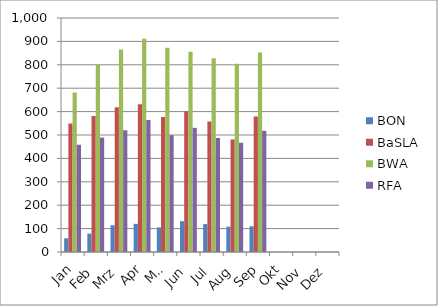
| Category | BON | BaSLA | BWA | RFA |
|---|---|---|---|---|
| Jan | 58.682 | 549.318 | 681.864 | 458.182 |
| Feb | 78.65 | 581.35 | 799.4 | 488.95 |
| Mrz | 114 | 618.55 | 865.05 | 520.15 |
| Apr | 120.286 | 631.333 | 910.81 | 564.381 |
| Mai | 104.85 | 576.85 | 872.85 | 499.3 |
| Jun | 131.75 | 601.6 | 855.95 | 530.5 |
| Jul | 119.217 | 557.217 | 827.783 | 487.478 |
| Aug | 108.429 | 481.095 | 804.762 | 466.857 |
| Sep | 109.857 | 578.619 | 852.095 | 518.048 |
| Okt | 0 | 0 | 0 | 0 |
| Nov | 0 | 0 | 0 | 0 |
| Dez | 0 | 0 | 0 | 0 |